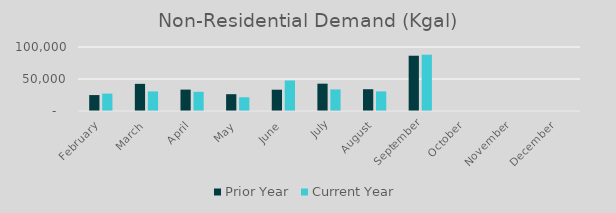
| Category | Prior Year | Current Year |
|---|---|---|
| February | 24891.705 | 27184.287 |
| March | 42416.796 | 30591.784 |
| April | 33427.881 | 30008.586 |
| May | 26254.448 | 21459.484 |
| June | 33248.873 | 47687.401 |
| July | 42679.938 | 33702.696 |
| August | 34036.498 | 30630.765 |
| September | 86367.775 | 87939.966 |
| October | 0 | 0 |
| November | 0 | 0 |
| December | 0 | 0 |